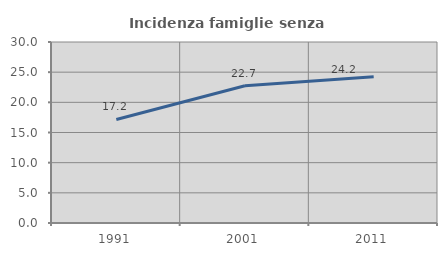
| Category | Incidenza famiglie senza nuclei |
|---|---|
| 1991.0 | 17.161 |
| 2001.0 | 22.743 |
| 2011.0 | 24.221 |